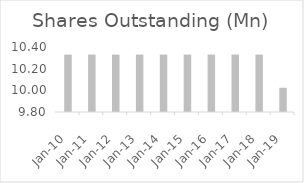
| Category | Shares Outstanding (Mn) |
|---|---|
| 2010-03-31 | 10.33 |
| 2011-03-31 | 10.33 |
| 2012-03-31 | 10.33 |
| 2013-03-31 | 10.33 |
| 2014-03-31 | 10.33 |
| 2015-03-31 | 10.33 |
| 2016-03-31 | 10.33 |
| 2017-03-31 | 10.33 |
| 2018-03-31 | 10.33 |
| 2019-03-31 | 10.024 |